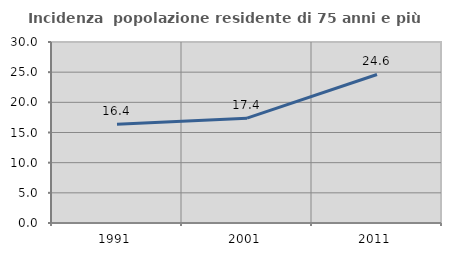
| Category | Incidenza  popolazione residente di 75 anni e più |
|---|---|
| 1991.0 | 16.376 |
| 2001.0 | 17.38 |
| 2011.0 | 24.62 |